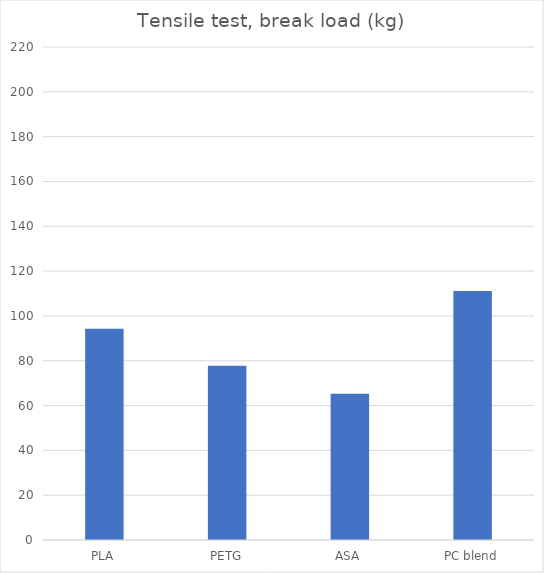
| Category | Average (kg) |
|---|---|
| PLA | 94.3 |
| PETG | 77.8 |
| ASA | 65.3 |
| PC blend | 111.1 |